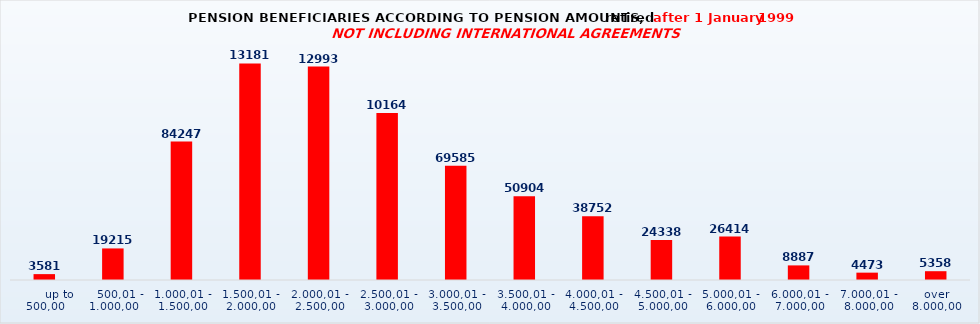
| Category | Series 0 |
|---|---|
|       up to 500,00 | 3581 |
|    500,01 - 1.000,00 | 19215 |
| 1.000,01 - 1.500,00 | 84247 |
| 1.500,01 - 2.000,00 | 131819 |
| 2.000,01 - 2.500,00 | 129938 |
| 2.500,01 - 3.000,00 | 101645 |
| 3.000,01 - 3.500,00 | 69585 |
| 3.500,01 - 4.000,00 | 50904 |
| 4.000,01 - 4.500,00 | 38752 |
| 4.500,01 - 5.000,00 | 24338 |
| 5.000,01 - 6.000,00 | 26414 |
| 6.000,01 - 7.000,00 | 8887 |
| 7.000,01 - 8.000,00 | 4473 |
| over 8.000,00 | 5358 |